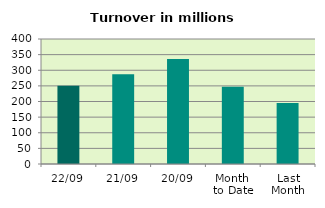
| Category | Series 0 |
|---|---|
| 22/09 | 250.287 |
| 21/09 | 286.871 |
| 20/09 | 335.943 |
| Month 
to Date | 247.359 |
| Last
Month | 194.848 |